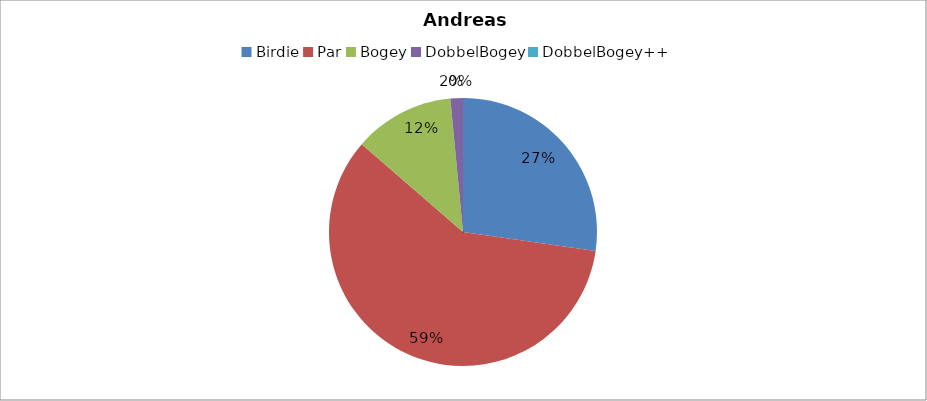
| Category | Andreas Askeland |
|---|---|
| Birdie | 18 |
| Par | 39 |
| Bogey | 8 |
| DobbelBogey | 1 |
| DobbelBogey++ | 0 |